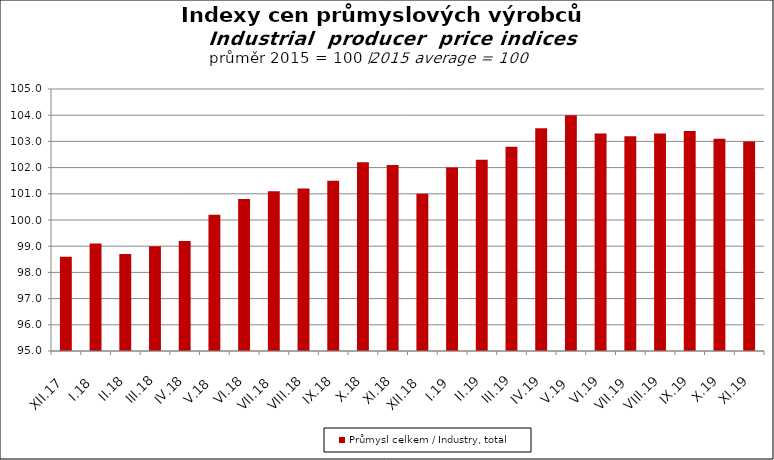
| Category | Průmysl celkem / Industry, total |
|---|---|
| XII.17 | 98.6 |
| I.18 | 99.1 |
| II.18 | 98.7 |
| III.18 | 99 |
| IV.18 | 99.2 |
| V.18 | 100.2 |
| VI.18 | 100.8 |
| VII.18 | 101.1 |
| VIII.18 | 101.2 |
| IX.18 | 101.5 |
| X.18 | 102.2 |
| XI.18 | 102.1 |
| XII.18 | 101 |
| I.19 | 102 |
| II.19 | 102.3 |
| III.19 | 102.8 |
| IV.19 | 103.5 |
| V.19 | 104 |
| VI.19 | 103.3 |
| VII.19 | 103.2 |
| VIII.19 | 103.3 |
| IX.19 | 103.4 |
| X.19 | 103.1 |
| XI.19 | 103 |